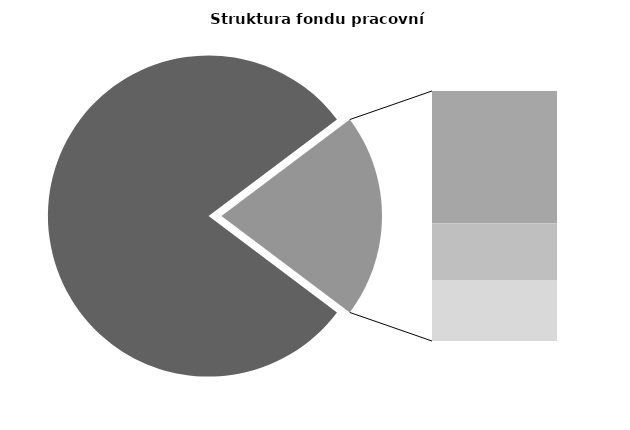
| Category | Series 0 |
|---|---|
| Průměrná měsíční odpracovaná doba bez přesčasu | 136.386 |
| Dovolená | 18.629 |
| Nemoc | 7.968 |
| Jiné | 8.587 |